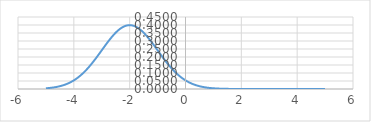
| Category | Series 0 |
|---|---|
| -5.0 | 0.004 |
| -4.9 | 0.006 |
| -4.8 | 0.008 |
| -4.7 | 0.01 |
| -4.6 | 0.014 |
| -4.5 | 0.018 |
| -4.4 | 0.022 |
| -4.3 | 0.028 |
| -4.2 | 0.035 |
| -4.1 | 0.044 |
| -4.0 | 0.054 |
| -3.9 | 0.066 |
| -3.8 | 0.079 |
| -3.7 | 0.094 |
| -3.6 | 0.111 |
| -3.50000000000001 | 0.13 |
| -3.40000000000001 | 0.15 |
| -3.30000000000001 | 0.171 |
| -3.20000000000001 | 0.194 |
| -3.10000000000001 | 0.218 |
| -3.00000000000001 | 0.242 |
| -2.90000000000001 | 0.266 |
| -2.80000000000001 | 0.29 |
| -2.70000000000001 | 0.312 |
| -2.60000000000001 | 0.333 |
| -2.50000000000001 | 0.352 |
| -2.40000000000001 | 0.368 |
| -2.30000000000001 | 0.381 |
| -2.20000000000001 | 0.391 |
| -2.10000000000001 | 0.397 |
| -2.00000000000001 | 0.399 |
| -1.90000000000001 | 0.397 |
| -1.80000000000001 | 0.391 |
| -1.70000000000001 | 0.381 |
| -1.60000000000001 | 0.368 |
| -1.50000000000001 | 0.352 |
| -1.40000000000001 | 0.333 |
| -1.30000000000001 | 0.312 |
| -1.20000000000001 | 0.29 |
| -1.10000000000001 | 0.266 |
| -1.00000000000001 | 0.242 |
| -0.90000000000001 | 0.218 |
| -0.80000000000001 | 0.194 |
| -0.70000000000002 | 0.171 |
| -0.60000000000002 | 0.15 |
| -0.50000000000002 | 0.13 |
| -0.40000000000002 | 0.111 |
| -0.30000000000002 | 0.094 |
| -0.20000000000002 | 0.079 |
| -0.10000000000002 | 0.066 |
| -2.04281036531029e-14 | 0.054 |
| 0.0999999999999801 | 0.044 |
| 0.19999999999998 | 0.035 |
| 0.29999999999998 | 0.028 |
| 0.39999999999998 | 0.022 |
| 0.49999999999998 | 0.018 |
| 0.59999999999998 | 0.014 |
| 0.69999999999998 | 0.01 |
| 0.79999999999998 | 0.008 |
| 0.89999999999998 | 0.006 |
| 0.99999999999998 | 0.004 |
| 1.09999999999998 | 0.003 |
| 1.19999999999998 | 0.002 |
| 1.29999999999998 | 0.002 |
| 1.39999999999998 | 0.001 |
| 1.49999999999998 | 0.001 |
| 1.59999999999998 | 0.001 |
| 1.69999999999998 | 0 |
| 1.79999999999998 | 0 |
| 1.89999999999998 | 0 |
| 1.99999999999998 | 0 |
| 2.09999999999997 | 0 |
| 2.19999999999997 | 0 |
| 2.29999999999997 | 0 |
| 2.39999999999997 | 0 |
| 2.49999999999997 | 0 |
| 2.59999999999997 | 0 |
| 2.69999999999997 | 0 |
| 2.79999999999997 | 0 |
| 2.89999999999997 | 0 |
| 2.99999999999997 | 0 |
| 3.09999999999997 | 0 |
| 3.19999999999997 | 0 |
| 3.29999999999997 | 0 |
| 3.39999999999997 | 0 |
| 3.49999999999997 | 0 |
| 3.59999999999997 | 0 |
| 3.69999999999997 | 0 |
| 3.79999999999997 | 0 |
| 3.89999999999997 | 0 |
| 3.99999999999997 | 0 |
| 4.09999999999997 | 0 |
| 4.19999999999997 | 0 |
| 4.29999999999997 | 0 |
| 4.39999999999997 | 0 |
| 4.49999999999997 | 0 |
| 4.59999999999997 | 0 |
| 4.69999999999997 | 0 |
| 4.79999999999997 | 0 |
| 4.89999999999996 | 0 |
| 4.99999999999996 | 0 |